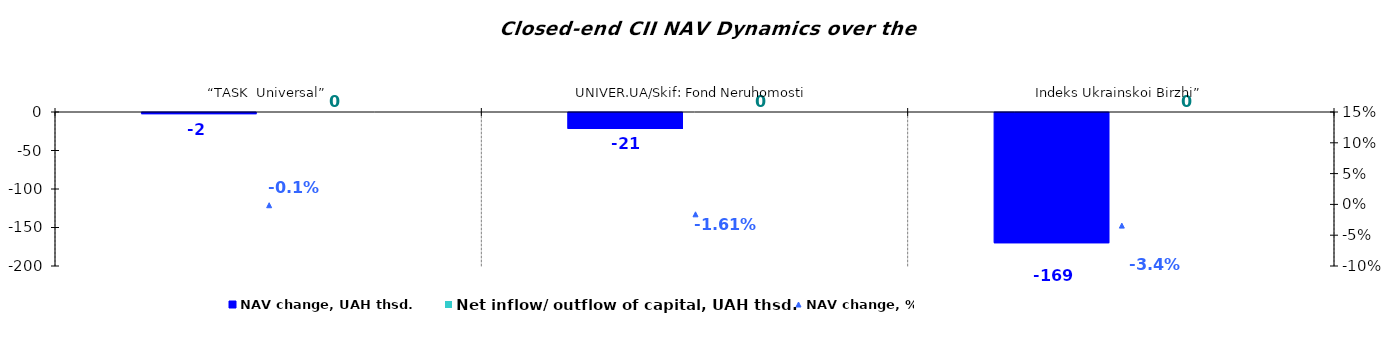
| Category | NAV change, UAH thsd. | Net inflow/ outflow of capital, UAH thsd. |
|---|---|---|
| “TASK  Universal” | -1.531 | 0 |
| UNIVER.UA/Skif: Fond Neruhomosti | -20.785 | 0 |
| Indeks Ukrainskoi Birzhi” | -169.177 | 0 |